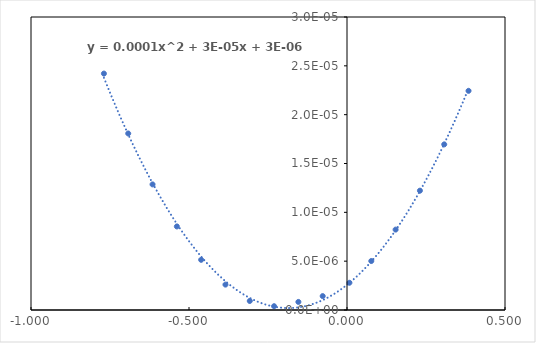
| Category | Series 0 |
|---|---|
| -0.7692307692307693 | 0 |
| -0.6923076923076923 | 0 |
| -0.6153846153846154 | 0 |
| -0.5384615384615385 | 0 |
| -0.4615384615384615 | 0 |
| -0.38461538461538464 | 0 |
| -0.3076923076923069 | 0 |
| -0.23076923076922998 | 0 |
| -0.15384615384615308 | 0 |
| -0.07692307692307623 | 0 |
| 0.007692307692307692 | 0 |
| 0.07692307692307693 | 0 |
| 0.15384615384615385 | 0 |
| 0.23076923076923075 | 0 |
| 0.3076923076923077 | 0 |
| 0.38461538461538464 | 0 |